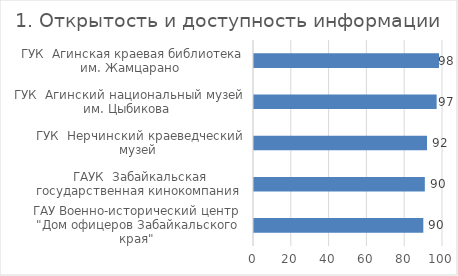
| Category | 1. Открытость и доступность информации |
|---|---|
| ГАУ Военно-исторический центр  "Дом офицеров Забайкальского края"  | 89.583 |
| ГАУК  Забайкальская государственная кинокомпания  | 90.39 |
| ГУК  Нерчинский краеведческий музей  | 91.545 |
| ГУК  Агинский национальный музей им. Цыбикова  | 96.643 |
| ГУК  Агинская краевая библиотека им. Жамцарано  | 97.896 |